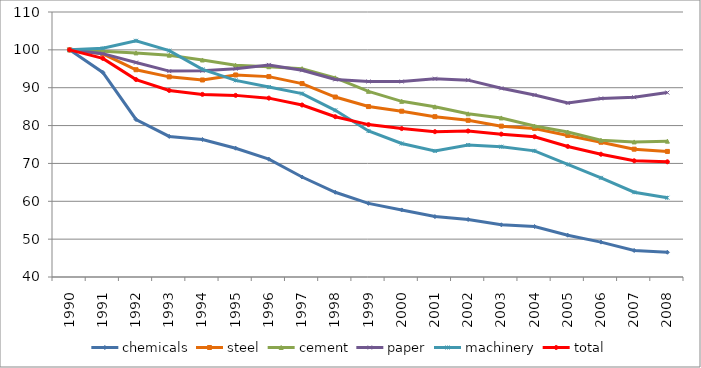
| Category | chemicals | steel | cement | paper | machinery | total |
|---|---|---|---|---|---|---|
| 1990.0 | 100 | 100 | 100 | 100 | 100 | 100 |
| 1991.0 | 94.04 | 98.961 | 99.662 | 98.994 | 100.428 | 97.748 |
| 1992.0 | 81.607 | 94.75 | 99.2 | 96.644 | 102.403 | 92.155 |
| 1993.0 | 77.124 | 92.869 | 98.588 | 94.383 | 99.803 | 89.276 |
| 1994.0 | 76.324 | 92.045 | 97.325 | 94.502 | 94.857 | 88.239 |
| 1995.0 | 74.018 | 93.37 | 95.945 | 95.041 | 91.935 | 87.976 |
| 1996.0 | 71.119 | 92.93 | 95.547 | 96.023 | 90.182 | 87.247 |
| 1997.0 | 66.415 | 91.09 | 95.039 | 94.618 | 88.448 | 85.437 |
| 1998.0 | 62.386 | 87.54 | 92.617 | 92.193 | 84.025 | 82.343 |
| 1999.0 | 59.454 | 85.021 | 89.05 | 91.643 | 78.561 | 80.256 |
| 2000.0 | 57.723 | 83.793 | 86.397 | 91.627 | 75.266 | 79.205 |
| 2001.0 | 55.959 | 82.353 | 84.959 | 92.383 | 73.312 | 78.391 |
| 2002.0 | 55.198 | 81.387 | 83.109 | 91.998 | 74.871 | 78.569 |
| 2003.0 | 53.792 | 79.85 | 82.019 | 89.855 | 74.422 | 77.737 |
| 2004.0 | 53.341 | 79.245 | 79.879 | 88.078 | 73.324 | 77.061 |
| 2005.0 | 51.034 | 77.396 | 78.289 | 85.977 | 69.733 | 74.489 |
| 2006.0 | 49.213 | 75.602 | 76.126 | 87.16 | 66.196 | 72.428 |
| 2007.0 | 47.002 | 73.765 | 75.678 | 87.487 | 62.391 | 70.699 |
| 2008.0 | 46.534 | 73.169 | 75.88 | 88.709 | 60.932 | 70.434 |